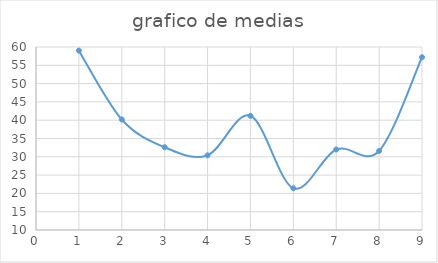
| Category | Series 0 |
|---|---|
| 0 | 59 |
| 1 | 40.2 |
| 2 | 32.6 |
| 3 | 30.4 |
| 4 | 41.2 |
| 5 | 21.4 |
| 6 | 32 |
| 7 | 31.6 |
| 8 | 57.2 |